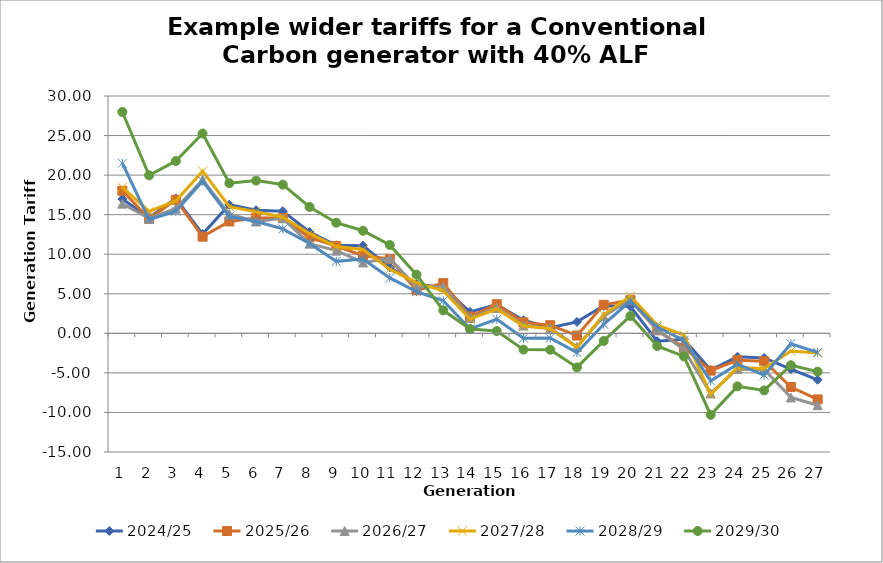
| Category | 2024/25 | 2025/26 | 2026/27 | 2027/28 | 2028/29 | 2029/30 |
|---|---|---|---|---|---|---|
| 0 | 16.985 | 18.018 | 16.395 | 18.457 | 21.505 | 27.979 |
| 1 | 14.616 | 14.487 | 14.519 | 15.413 | 14.374 | 19.969 |
| 2 | 17.054 | 16.872 | 15.777 | 16.728 | 15.436 | 21.779 |
| 3 | 12.552 | 12.221 | 19.417 | 20.501 | 19.239 | 25.26 |
| 4 | 16.263 | 14.14 | 15.074 | 16.007 | 14.762 | 18.981 |
| 5 | 15.565 | 14.578 | 14.137 | 15.374 | 14.13 | 19.302 |
| 6 | 15.447 | 14.582 | 14.538 | 14.683 | 13.201 | 18.796 |
| 7 | 12.804 | 12.11 | 11.337 | 12.626 | 11.353 | 15.975 |
| 8 | 11.132 | 11.039 | 10.453 | 10.967 | 9.101 | 13.98 |
| 9 | 11.077 | 9.815 | 8.955 | 10.592 | 9.392 | 12.967 |
| 10 | 8.346 | 9.41 | 9.468 | 8.118 | 7.011 | 11.166 |
| 11 | 6.226 | 5.443 | 5.857 | 6.399 | 5.272 | 7.416 |
| 12 | 5.764 | 6.347 | 5.912 | 5.373 | 4.116 | 2.907 |
| 13 | 2.711 | 2.121 | 1.935 | 1.804 | 0.566 | 0.54 |
| 14 | 3.619 | 3.681 | 3.215 | 3.077 | 1.784 | 0.292 |
| 15 | 1.654 | 1.381 | 0.987 | 0.932 | -0.614 | -2.059 |
| 16 | 0.72 | 1.028 | 0.66 | 0.592 | -0.592 | -2.075 |
| 17 | 1.446 | -0.278 | -1.707 | -1.784 | -2.427 | -4.308 |
| 18 | 3.478 | 3.605 | 2.16 | 2.371 | 1.137 | -0.964 |
| 19 | 3.393 | 4.196 | 4.273 | 4.69 | 4.082 | 2.192 |
| 20 | -0.994 | 0.387 | 0.414 | 1.036 | 0.794 | -1.6 |
| 21 | -0.742 | -1.812 | -2.064 | -0.216 | -0.888 | -2.913 |
| 22 | -4.641 | -4.718 | -7.593 | -7.725 | -6.017 | -10.301 |
| 23 | -2.968 | -3.397 | -4.494 | -4.335 | -3.894 | -6.704 |
| 24 | -3.114 | -3.533 | -4.572 | -4.446 | -5.28 | -7.212 |
| 25 | -4.533 | -6.785 | -8.098 | -2.238 | -1.312 | -4.025 |
| 26 | -5.87 | -8.358 | -9.086 | -2.489 | -2.403 | -4.842 |